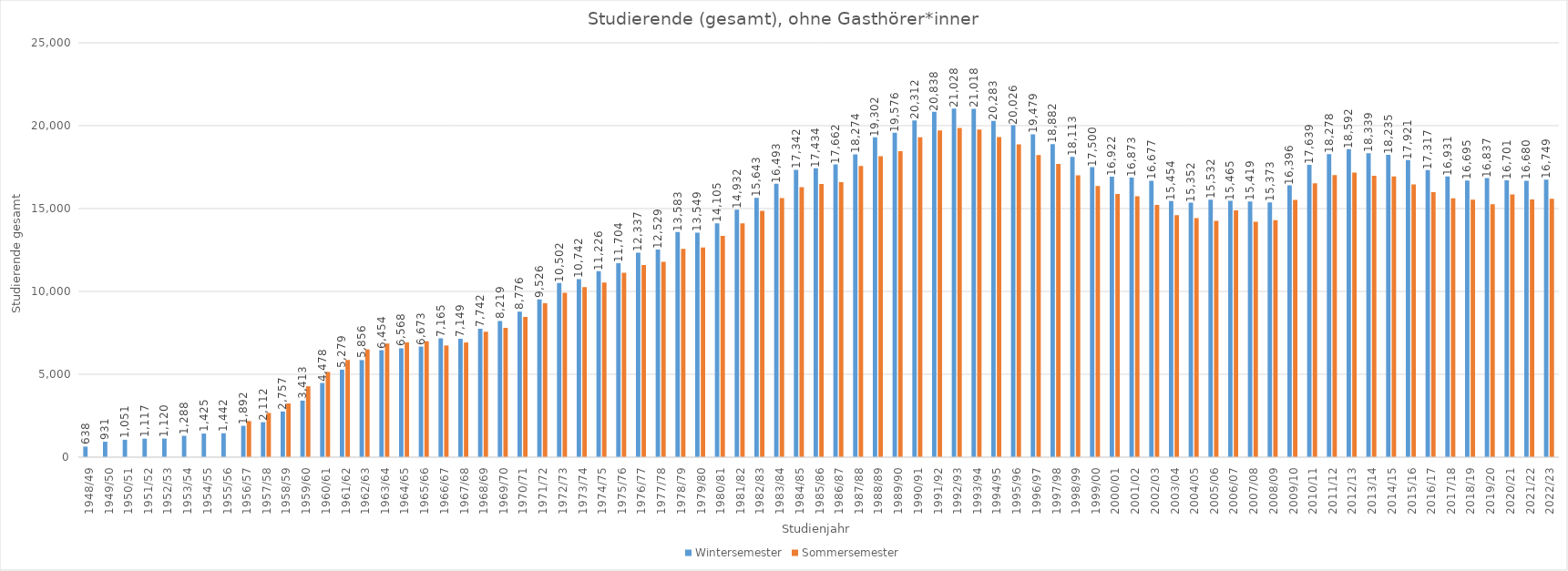
| Category | Wintersemester | Sommersemester |
|---|---|---|
| 1948/49 | 638 | 0 |
| 1949/50 | 931 | 0 |
| 1950/51 | 1051 | 0 |
| 1951/52 | 1117 | 0 |
| 1952/53 | 1120 | 0 |
| 1953/54 | 1288 | 0 |
| 1954/55 | 1425 | 0 |
| 1955/56 | 1442 | 0 |
| 1956/57 | 1892 | 2179 |
| 1957/58 | 2112 | 2669 |
| 1958/59 | 2757 | 3240 |
| 1959/60 | 3413 | 4275 |
| 1960/61 | 4478 | 5143 |
| 1961/62 | 5279 | 5864 |
| 1962/63 | 5856 | 6499 |
| 1963/64 | 6454 | 6856 |
| 1964/65 | 6568 | 6925 |
| 1965/66 | 6673 | 6993 |
| 1966/67 | 7165 | 6739 |
| 1967/68 | 7149 | 6918 |
| 1968/69 | 7742 | 7565 |
| 1969/70 | 8219 | 7804 |
| 1970/71 | 8776 | 8463 |
| 1971/72 | 9526 | 9281 |
| 1972/73 | 10502 | 9915 |
| 1973/74 | 10742 | 10265 |
| 1974/75 | 11226 | 10535 |
| 1975/76 | 11704 | 11124 |
| 1976/77 | 12337 | 11587 |
| 1977/78 | 12529 | 11779 |
| 1978/79 | 13583 | 12564 |
| 1979/80 | 13549 | 12653 |
| 1980/81 | 14105 | 13349 |
| 1981/82 | 14932 | 14102 |
| 1982/83 | 15643 | 14860 |
| 1983/84 | 16493 | 15633 |
| 1984/85 | 17342 | 16296 |
| 1985/86 | 17434 | 16486 |
| 1986/87 | 17662 | 16592 |
| 1987/88 | 18274 | 17570 |
| 1988/89 | 19302 | 18162 |
| 1989/90 | 19576 | 18462 |
| 1990/91 | 20312 | 19302 |
| 1991/92 | 20838 | 19710 |
| 1992/93 | 21028 | 19860 |
| 1993/94 | 21018 | 19773 |
| 1994/95 | 20283 | 19318 |
| 1995/96 | 20026 | 18870 |
| 1996/97 | 19479 | 18225 |
| 1997/98 | 18882 | 17686 |
| 1998/99 | 18113 | 17005 |
| 1999/00 | 17500 | 16363 |
| 2000/01 | 16922 | 15875 |
| 2001/02 | 16873 | 15747 |
| 2002/03 | 16677 | 15213 |
| 2003/04 | 15454 | 14600 |
| 2004/05 | 15352 | 14424 |
| 2005/06 | 15532 | 14262 |
| 2006/07 | 15465 | 14895 |
| 2007/08 | 15419 | 14207 |
| 2008/09 | 15373 | 14301 |
| 2009/10 | 16396 | 15519 |
| 2010/11 | 17639 | 16520 |
| 2011/12 | 18278 | 17026 |
| 2012/13 | 18592 | 17166 |
| 2013/14 | 18339 | 16984 |
| 2014/15 | 18235 | 16931 |
| 2015/16 | 17921 | 16457 |
| 2016/17 | 17317 | 15988 |
| 2017/18 | 16931 | 15616 |
| 2018/19 | 16695 | 15542 |
| 2019/20 | 16837 | 15260 |
| 2020/21 | 16701 | 15849 |
| 2021/22 | 16680 | 15547 |
| 2022/23 | 16749 | 15590 |